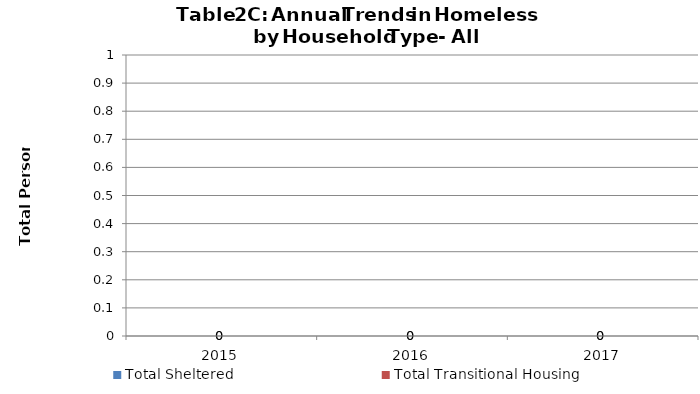
| Category | Total Sheltered | Total Transitional Housing |
|---|---|---|
| 2015.0 | 0 | 0 |
| 2016.0 | 0 | 0 |
| 2017.0 | 0 | 0 |